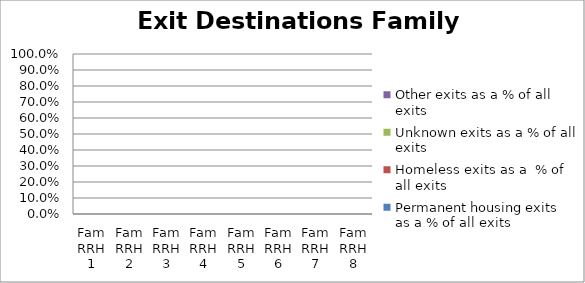
| Category | Permanent housing exits as a % of all exits | Homeless exits as a  % of all exits | Unknown exits as a % of all exits | Other exits as a % of all exits |
|---|---|---|---|---|
| Fam RRH 1 | 0 | 0 | 0 | 0 |
| Fam RRH 2 | 0 | 0 | 0 | 0 |
| Fam RRH 3 | 0 | 0 | 0 | 0 |
| Fam RRH 4 | 0 | 0 | 0 | 0 |
| Fam RRH 5 | 0 | 0 | 0 | 0 |
| Fam RRH 6 | 0 | 0 | 0 | 0 |
| Fam RRH 7 | 0 | 0 | 0 | 0 |
| Fam RRH 8 | 0 | 0 | 0 | 0 |